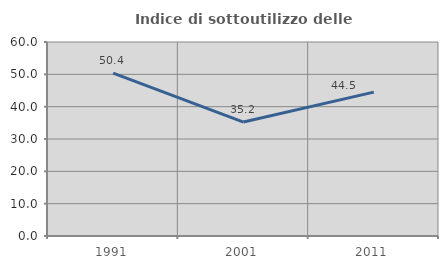
| Category | Indice di sottoutilizzo delle abitazioni  |
|---|---|
| 1991.0 | 50.39 |
| 2001.0 | 35.233 |
| 2011.0 | 44.507 |